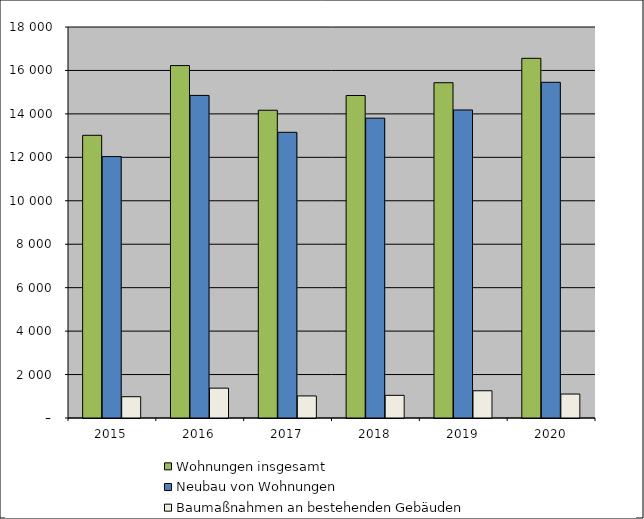
| Category | Wohnungen insgesamt | Neubau von Wohnungen | Baumaßnahmen an bestehenden Gebäuden |
|---|---|---|---|
| 2015.0 | 13014 | 12034 | 980 |
| 2016.0 | 16224 | 14850 | 1374 |
| 2017.0 | 14168 | 13152 | 1016 |
| 2018.0 | 14846 | 13803 | 1043 |
| 2019.0 | 15435 | 14181 | 1254 |
| 2020.0 | 16558 | 15455 | 1103 |